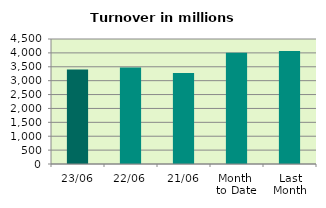
| Category | Series 0 |
|---|---|
| 23/06 | 3405.424 |
| 22/06 | 3477.511 |
| 21/06 | 3276.317 |
| Month 
to Date | 4006.676 |
| Last
Month | 4067.502 |